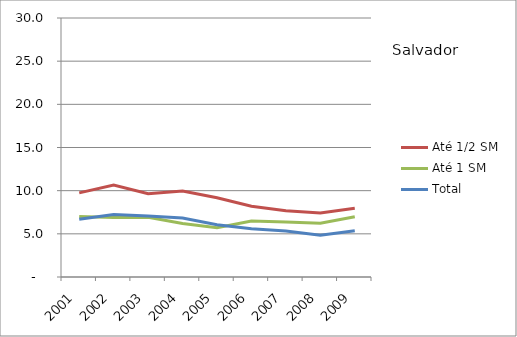
| Category | Até 1/2 SM | Até 1 SM | Total |
|---|---|---|---|
| 2001.0 | 9.74 | 7 | 6.7 |
| 2002.0 | 10.66 | 6.9 | 7.24 |
| 2003.0 | 9.64 | 6.93 | 7.07 |
| 2004.0 | 9.95 | 6.19 | 6.84 |
| 2005.0 | 9.18 | 5.71 | 6.06 |
| 2006.0 | 8.19 | 6.49 | 5.58 |
| 2007.0 | 7.67 | 6.36 | 5.34 |
| 2008.0 | 7.41 | 6.22 | 4.84 |
| 2009.0 | 7.96 | 6.97 | 5.36 |